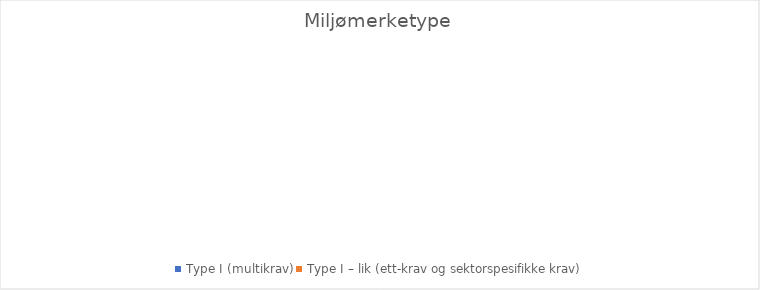
| Category | Series 0 |
|---|---|
| Type I (multikrav) | 0 |
| Type I – lik (ett-krav og sektorspesifikke krav) | 0 |